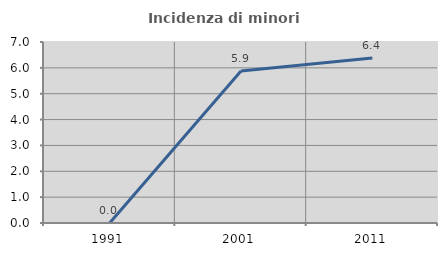
| Category | Incidenza di minori stranieri |
|---|---|
| 1991.0 | 0 |
| 2001.0 | 5.882 |
| 2011.0 | 6.383 |